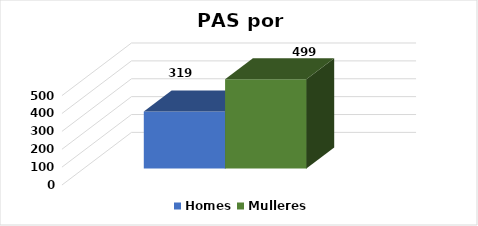
| Category | Homes | Mulleres |
|---|---|---|
| 0 | 319 | 499 |